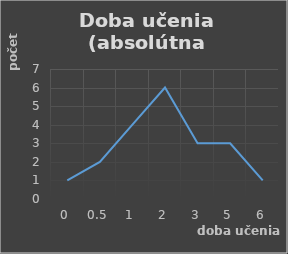
| Category | Series 0 |
|---|---|
| 0.0 | 1 |
| 0.5 | 2 |
| 1.0 | 4 |
| 2.0 | 6 |
| 3.0 | 3 |
| 5.0 | 3 |
| 6.0 | 1 |